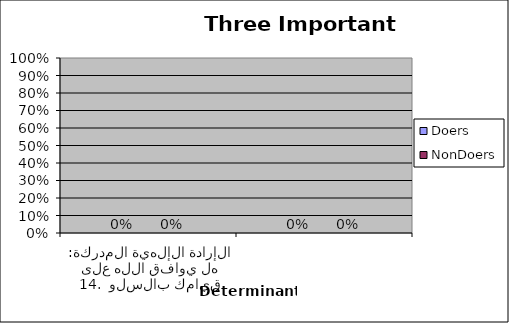
| Category | Doers | NonDoers |
|---|---|---|
| 0 | 1 | 1 |